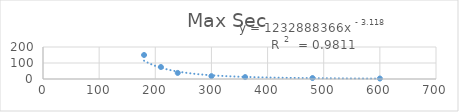
| Category | Max Sec |
|---|---|
| 180.0 | 150 |
| 210.0 | 75 |
| 240.0 | 38 |
| 300.0 | 18 |
| 360.0 | 12 |
| 480.0 | 6 |
| 600.0 | 3 |